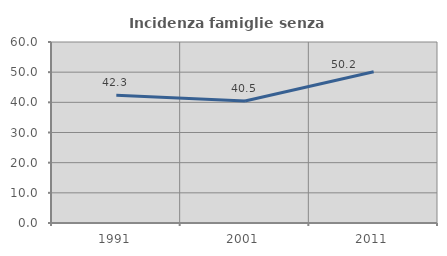
| Category | Incidenza famiglie senza nuclei |
|---|---|
| 1991.0 | 42.322 |
| 2001.0 | 40.458 |
| 2011.0 | 50.156 |